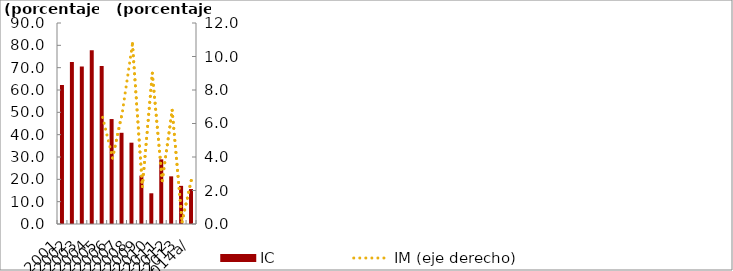
| Category | IC |
|---|---|
| 2001 | 62.237 |
| 2002 | 72.508 |
| 2003 | 70.533 |
| 2004 | 77.766 |
| 2005 | 70.737 |
| 2006 | 46.989 |
| 2007 | 40.844 |
| 2008 | 36.41 |
| 2009 | 21.662 |
| 2010 | 13.755 |
| 2011 | 28.94 |
| 2012 | 21.341 |
| 2013 | 17.081 |
| 2014a/ | 15.646 |